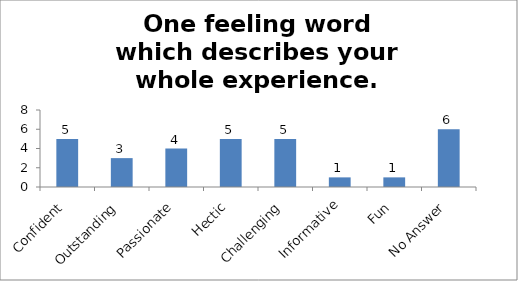
| Category | One feeling word which describes your whole experience. |
|---|---|
| Confident | 5 |
| Outstanding | 3 |
| Passionate | 4 |
| Hectic | 5 |
| Challenging | 5 |
| Informative | 1 |
| Fun | 1 |
| No Answer | 6 |